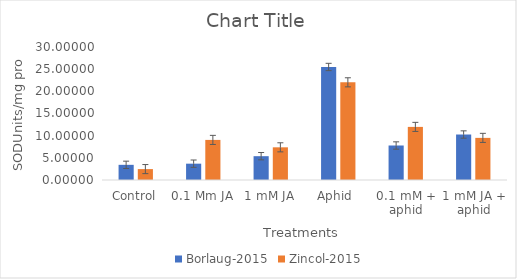
| Category | Borlaug-2015 | Zincol-2015 |
|---|---|---|
| Control | 3.422 | 2.461 |
| 0.1 Mm JA | 3.683 | 9.042 |
| 1 mM JA | 5.372 | 7.371 |
| Aphid  | 25.492 | 22.033 |
| 0.1 mM + aphid | 7.783 | 11.978 |
| 1 mM JA + aphid | 10.26 | 9.501 |